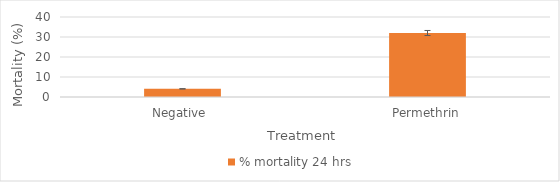
| Category | % mortality 24 hrs |
|---|---|
| Negative  | 4.082 |
| Permethrin | 32 |